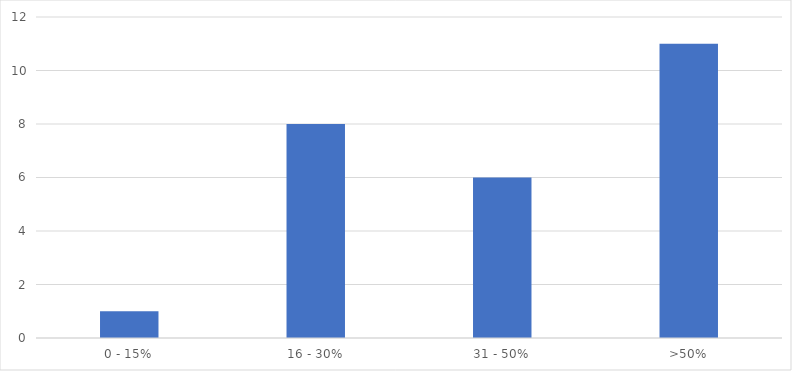
| Category | Number of Responses |
|---|---|
| 0 - 15% | 1 |
| 16 - 30% | 8 |
| 31 - 50% | 6 |
| >50% | 11 |